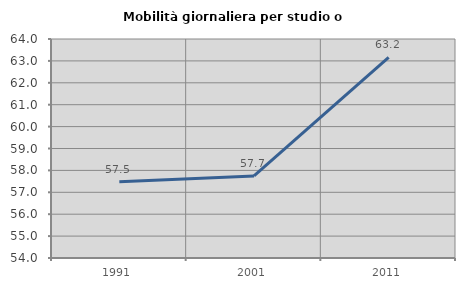
| Category | Mobilità giornaliera per studio o lavoro |
|---|---|
| 1991.0 | 57.48 |
| 2001.0 | 57.749 |
| 2011.0 | 63.164 |